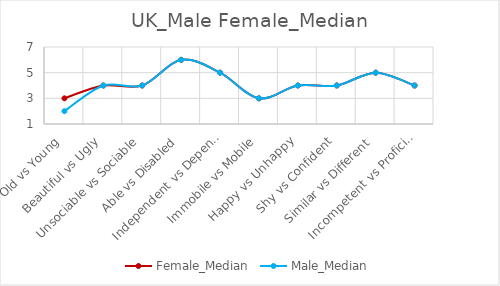
| Category | Female_Median | Male_Median |
|---|---|---|
| Old vs Young | 3 | 2 |
|  Beautiful vs Ugly | 4 | 4 |
| Unsociable vs Sociable | 4 | 4 |
| Able vs Disabled | 6 | 6 |
| Independent vs Dependent | 5 | 5 |
| Immobile vs Mobile | 3 | 3 |
| Happy vs Unhappy | 4 | 4 |
| Shy vs Confident | 4 | 4 |
| Similar vs Different | 5 | 5 |
| Incompetent vs Proficient | 4 | 4 |